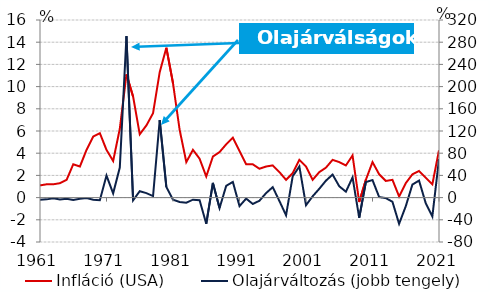
| Category | Infláció (USA) |
|---|---|
| 22282.0 | 1.1 |
| 22647.0 | 1.2 |
| 23012.0 | 1.2 |
| 23377.0 | 1.3 |
| 23743.0 | 1.6 |
| 24108.0 | 3 |
| 24473.0 | 2.8 |
| 24838.0 | 4.3 |
| 25204.0 | 5.5 |
| 25569.0 | 5.8 |
| 25934.0 | 4.3 |
| 26299.0 | 3.3 |
| 26665.0 | 6.2 |
| 27030.0 | 11.1 |
| 27395.0 | 9.1 |
| 27760.0 | 5.7 |
| 28126.0 | 6.5 |
| 28491.0 | 7.6 |
| 28856.0 | 11.3 |
| 29221.0 | 13.5 |
| 29587.0 | 10.3 |
| 29952.0 | 6.1 |
| 30317.0 | 3.2 |
| 30682.0 | 4.3 |
| 31048.0 | 3.5 |
| 31413.0 | 1.9 |
| 31778.0 | 3.7 |
| 32143.0 | 4.1 |
| 32509.0 | 4.8 |
| 32874.0 | 5.4 |
| 33239.0 | 4.2 |
| 33604.0 | 3 |
| 33970.0 | 3 |
| 34335.0 | 2.6 |
| 34700.0 | 2.8 |
| 35065.0 | 2.9 |
| 35431.0 | 2.3 |
| 35796.0 | 1.6 |
| 36161.0 | 2.2 |
| 36526.0 | 3.4 |
| 36892.0 | 2.8 |
| 37257.0 | 1.6 |
| 37622.0 | 2.3 |
| 37987.0 | 2.7 |
| 38353.0 | 3.4 |
| 38718.0 | 3.2 |
| 39083.0 | 2.9 |
| 39448.0 | 3.8 |
| 39814.0 | -0.4 |
| 40179.0 | 1.6 |
| 40544.0 | 3.2 |
| 40909.0 | 2.1 |
| 41275.0 | 1.5 |
| 41640.0 | 1.6 |
| 42005.0 | 0.1 |
| 42370.0 | 1.3 |
| 42736.0 | 2.1 |
| 43101.0 | 2.4 |
| 43466.0 | 1.8 |
| 43831.0 | 1.2 |
| 44197.0 | 4.26 |